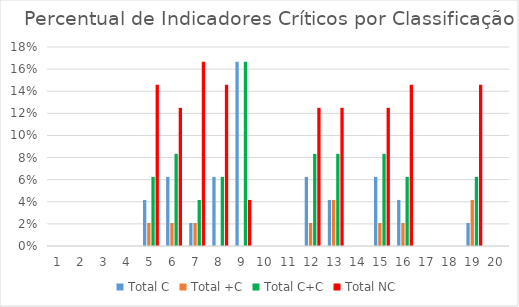
| Category | Total C | Total +C | Total C+C | Total NC |
|---|---|---|---|---|
| 0 | 0 | 0 | 0 | 0 |
| 1 | 0 | 0 | 0 | 0 |
| 2 | 0 | 0 | 0 | 0 |
| 3 | 0 | 0 | 0 | 0 |
| 4 | 0.042 | 0.021 | 0.062 | 0.146 |
| 5 | 0.062 | 0.021 | 0.083 | 0.125 |
| 6 | 0.021 | 0.021 | 0.042 | 0.167 |
| 7 | 0.062 | 0 | 0.062 | 0.146 |
| 8 | 0.167 | 0 | 0.167 | 0.042 |
| 9 | 0 | 0 | 0 | 0 |
| 10 | 0 | 0 | 0 | 0 |
| 11 | 0.062 | 0.021 | 0.083 | 0.125 |
| 12 | 0.042 | 0.042 | 0.083 | 0.125 |
| 13 | 0 | 0 | 0 | 0 |
| 14 | 0.062 | 0.021 | 0.083 | 0.125 |
| 15 | 0.042 | 0.021 | 0.062 | 0.146 |
| 16 | 0 | 0 | 0 | 0 |
| 17 | 0 | 0 | 0 | 0 |
| 18 | 0.021 | 0.042 | 0.062 | 0.146 |
| 19 | 0 | 0 | 0 | 0 |